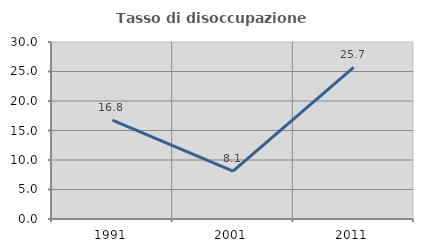
| Category | Tasso di disoccupazione giovanile  |
|---|---|
| 1991.0 | 16.778 |
| 2001.0 | 8.115 |
| 2011.0 | 25.706 |